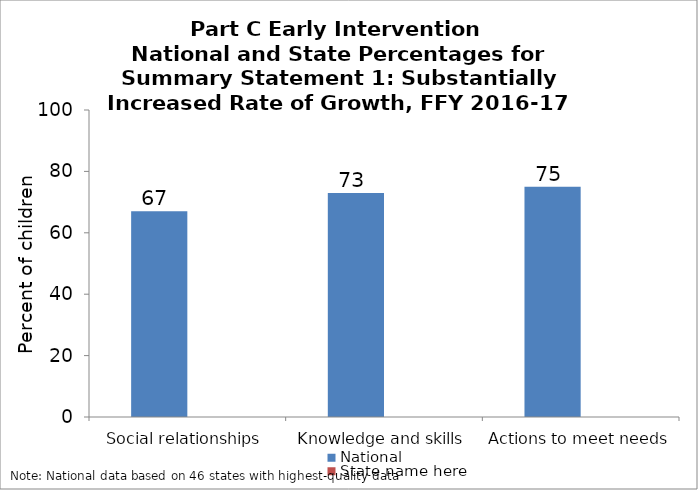
| Category | National | State name here |
|---|---|---|
| Social relationships | 67 |  |
| Knowledge and skills | 73 |  |
| Actions to meet needs | 75 |  |